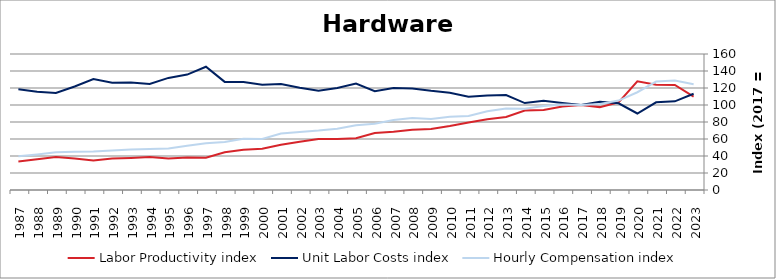
| Category | Labor Productivity index | Unit Labor Costs index | Hourly Compensation index |
|---|---|---|---|
| 2023.0 | 109.901 | 113.269 | 124.484 |
| 2022.0 | 123.553 | 104.276 | 128.836 |
| 2021.0 | 123.757 | 103.114 | 127.61 |
| 2020.0 | 127.779 | 90.014 | 115.019 |
| 2019.0 | 103.142 | 102.008 | 105.213 |
| 2018.0 | 97.511 | 103.829 | 101.245 |
| 2017.0 | 100 | 100 | 100 |
| 2016.0 | 98.187 | 102.423 | 100.566 |
| 2015.0 | 94.194 | 104.891 | 98.801 |
| 2014.0 | 93.582 | 102.253 | 95.69 |
| 2013.0 | 85.896 | 111.632 | 95.888 |
| 2012.0 | 83.277 | 111.32 | 92.704 |
| 2011.0 | 79.499 | 109.628 | 87.153 |
| 2010.0 | 75.186 | 114.499 | 86.087 |
| 2009.0 | 71.661 | 116.669 | 83.606 |
| 2008.0 | 71.008 | 119.462 | 84.828 |
| 2007.0 | 68.588 | 119.935 | 82.26 |
| 2006.0 | 66.937 | 116.275 | 77.831 |
| 2005.0 | 60.883 | 125.119 | 76.176 |
| 2004.0 | 60.03 | 120.118 | 72.107 |
| 2003.0 | 59.947 | 116.653 | 69.931 |
| 2002.0 | 56.767 | 120.363 | 68.326 |
| 2001.0 | 53.197 | 124.761 | 66.369 |
| 2000.0 | 48.619 | 123.696 | 60.14 |
| 1999.0 | 47.43 | 127.167 | 60.316 |
| 1998.0 | 44.509 | 127.176 | 56.605 |
| 1997.0 | 38.006 | 144.997 | 55.107 |
| 1996.0 | 38.307 | 135.756 | 52.004 |
| 1995.0 | 37.136 | 131.858 | 48.967 |
| 1994.0 | 38.693 | 124.683 | 48.244 |
| 1993.0 | 37.608 | 126.434 | 47.549 |
| 1992.0 | 36.965 | 126.087 | 46.608 |
| 1991.0 | 34.722 | 130.433 | 45.289 |
| 1990.0 | 36.991 | 121.785 | 45.049 |
| 1989.0 | 38.83 | 114.247 | 44.362 |
| 1988.0 | 36.212 | 115.6 | 41.862 |
| 1987.0 | 33.57 | 118.439 | 39.76 |